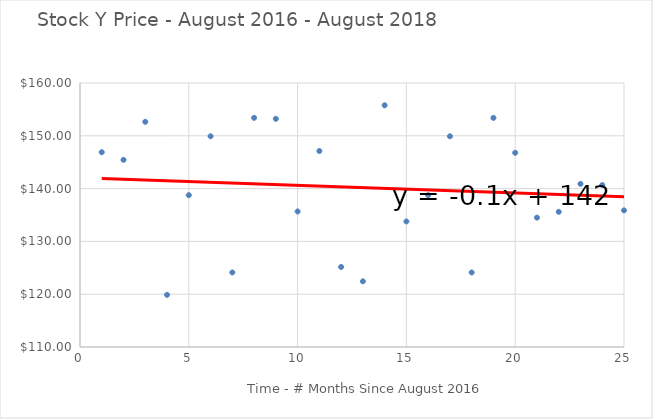
| Category | Stock Price (Y) |
|---|---|
| 1.0 | 146.89 |
| 2.0 | 145.45 |
| 3.0 | 152.65 |
| 4.0 | 119.87 |
| 5.0 | 138.76 |
| 6.0 | 149.91 |
| 7.0 | 124.12 |
| 8.0 | 153.4 |
| 9.0 | 153.21 |
| 10.0 | 135.67 |
| 11.0 | 147.12 |
| 12.0 | 125.16 |
| 13.0 | 122.44 |
| 14.0 | 155.78 |
| 15.0 | 133.78 |
| 16.0 | 138.76 |
| 17.0 | 149.91 |
| 18.0 | 124.12 |
| 19.0 | 153.4 |
| 20.0 | 146.78 |
| 21.0 | 134.5 |
| 22.0 | 135.6 |
| 23.0 | 140.9 |
| 24.0 | 140.67 |
| 25.0 | 135.88 |